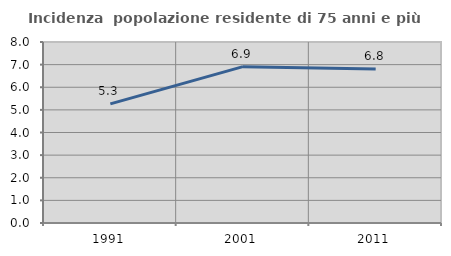
| Category | Incidenza  popolazione residente di 75 anni e più |
|---|---|
| 1991.0 | 5.263 |
| 2001.0 | 6.911 |
| 2011.0 | 6.803 |